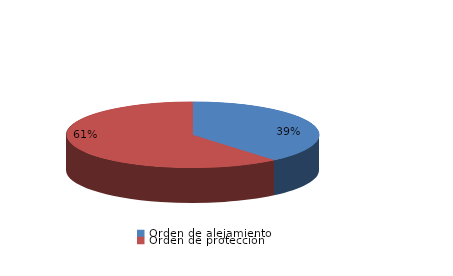
| Category | Series 0 |
|---|---|
| Orden de alejamiento | 7 |
| Orden de protección | 11 |